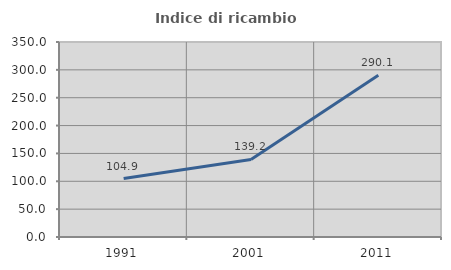
| Category | Indice di ricambio occupazionale  |
|---|---|
| 1991.0 | 104.917 |
| 2001.0 | 139.204 |
| 2011.0 | 290.103 |